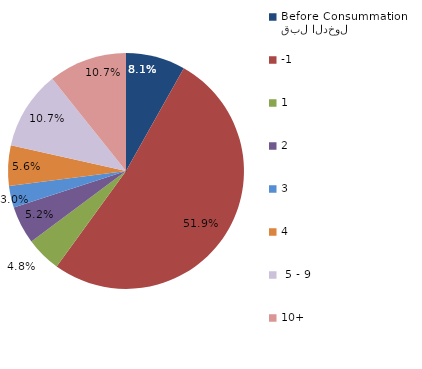
| Category | Series 0 |
|---|---|
| قبل الدخول
Before Consummation | 8.148 |
| -1 | 51.852 |
| 1 | 4.815 |
| 2 | 5.185 |
| 3 | 2.963 |
| 4 | 5.556 |
|  5 - 9 | 10.741 |
| 10+ | 10.741 |